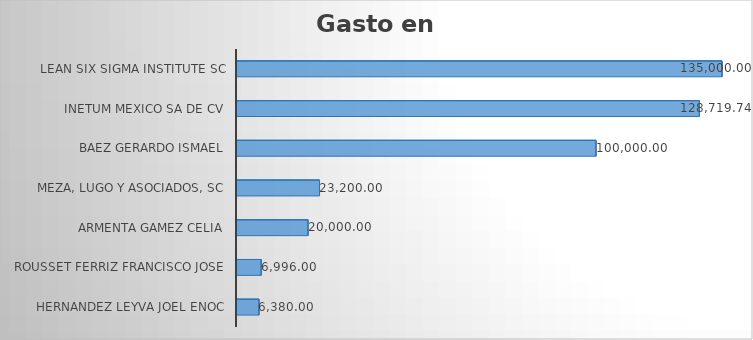
| Category | Suma |
|---|---|
| HERNANDEZ LEYVA JOEL ENOC | 6380 |
| ROUSSET FERRIZ FRANCISCO JOSE | 6996 |
| ARMENTA GAMEZ CELIA | 20000 |
| MEZA, LUGO Y ASOCIADOS, SC | 23200 |
| BAEZ GERARDO ISMAEL | 100000 |
| INETUM MEXICO SA DE CV | 128719.74 |
| LEAN SIX SIGMA INSTITUTE SC | 135000 |